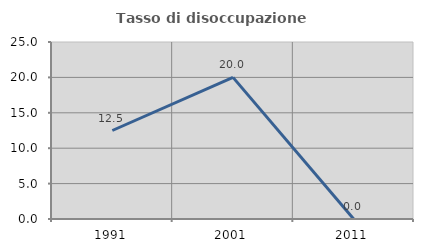
| Category | Tasso di disoccupazione giovanile  |
|---|---|
| 1991.0 | 12.5 |
| 2001.0 | 20 |
| 2011.0 | 0 |